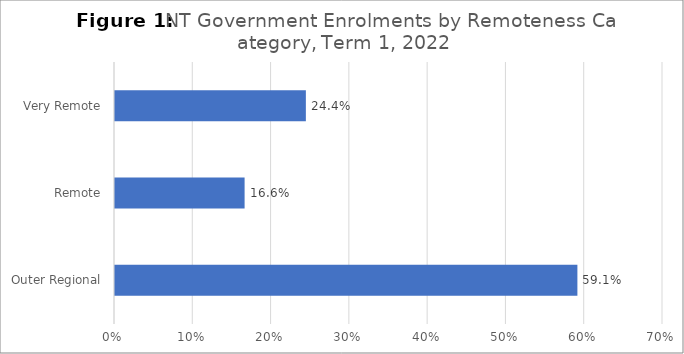
| Category | Series 0 |
|---|---|
| Outer Regional | 0.591 |
| Remote | 0.166 |
| Very Remote | 0.244 |